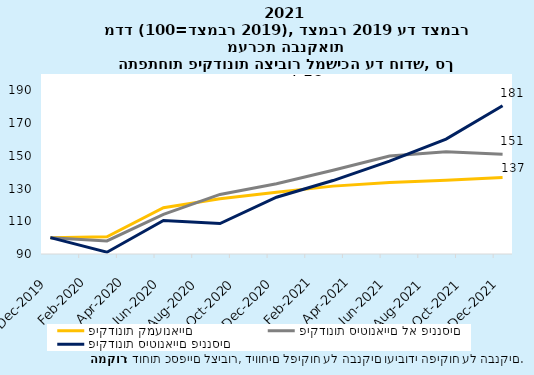
| Category | פיקדונות קמעונאיים | פיקדונות סיטונאיים לא פיננסים | פיקדונות סיטונאיים פיננסים |
|---|---|---|---|
| 2019-12-31 | 100 | 100 | 100 |
| 2020-03-31 | 100.477 | 97.962 | 91.087 |
| 2020-06-30 | 118.275 | 114.191 | 110.448 |
| 2020-09-30 | 123.783 | 126.4 | 108.634 |
| 2020-12-31 | 127.794 | 132.897 | 124.694 |
| 2021-03-31 | 131.479 | 141.196 | 134.884 |
| 2021-06-30 | 133.682 | 149.907 | 146.777 |
| 2021-09-30 | 135.055 | 152.463 | 160.201 |
| 2021-12-31 | 136.783 | 151.018 | 180.554 |